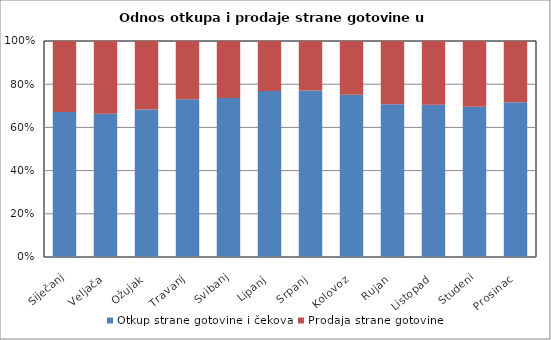
| Category | Otkup strane gotovine i čekova  | Prodaja strane gotovine  |
|---|---|---|
| Siječanj | 969531897 | 473833501 |
| Veljača | 1037926324 | 527519686 |
| Ožujak | 1327244279 | 616002822 |
| Travanj | 1596858044 | 588010613 |
| Svibanj | 1758302582 | 630286548 |
| Lipanj | 2385575927 | 718069690 |
| Srpanj | 3297079135 | 982081078 |
| Kolovoz | 3538818501 | 1169008844 |
| Rujan | 1939379435 | 804133925 |
| Listopad | 1540007324 | 645068692 |
| Studeni | 1274822036 | 557216569 |
| Prosinac | 1319520976 | 523576348 |